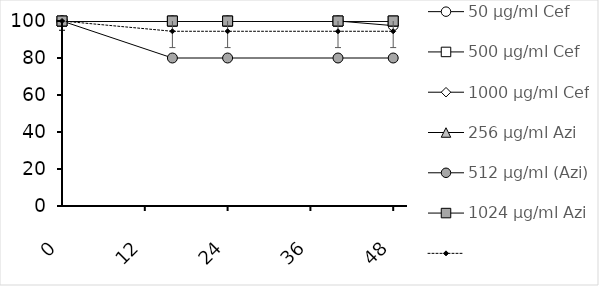
| Category | 50 µg/ml Cef | 500 µg/ml Cef | 1000 µg/ml Cef | 256 µg/ml Azi | 512 µg/ml (Azi) | 1024 µg/ml Azi | Series 6 |
|---|---|---|---|---|---|---|---|
| 0.0 | 100 | 100 | 100 | 100 | 100 | 100 | 100 |
| 16.0 | 100 | 100 | 100 | 100 | 80 | 100 | 94.444 |
| 24.0 | 100 | 100 | 100 | 100 | 80 | 100 | 94.444 |
| 40.0 | 100 | 100 | 100 | 100 | 80 | 100 | 94.444 |
| 48.0 | 97.5 | 100 | 100 | 100 | 80 | 100 | 94.444 |